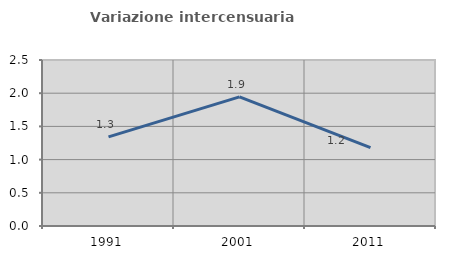
| Category | Variazione intercensuaria annua |
|---|---|
| 1991.0 | 1.342 |
| 2001.0 | 1.944 |
| 2011.0 | 1.18 |